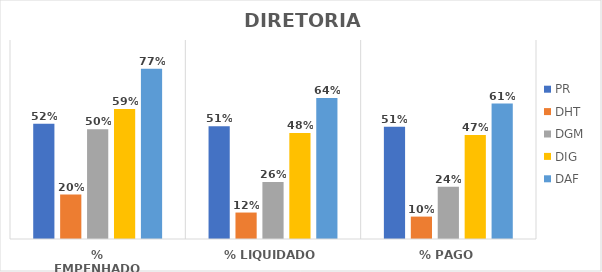
| Category | PR | DHT | DGM | DIG | DAF |
|---|---|---|---|---|---|
| % EMPENHADO | 0.521 | 0.201 | 0.496 | 0.588 | 0.77 |
| % LIQUIDADO | 0.51 | 0.12 | 0.257 | 0.48 | 0.638 |
| % PAGO | 0.507 | 0.101 | 0.236 | 0.47 | 0.612 |